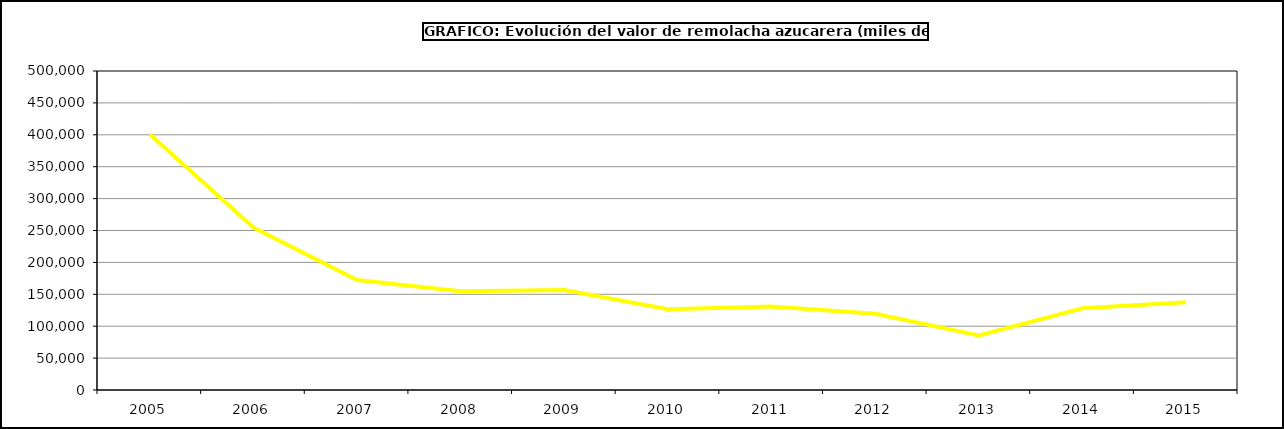
| Category | Valor |
|---|---|
| 2005.0 | 401010.06 |
| 2006.0 | 254641.255 |
| 2007.0 | 172339.526 |
| 2008.0 | 154723.398 |
| 2009.0 | 156763.564 |
| 2010.0 | 126535.709 |
| 2011.0 | 130682.292 |
| 2012.0 | 119377.935 |
| 2013.0 | 85662.388 |
| 2014.0 | 128081.83 |
| 2015.0 | 137355 |